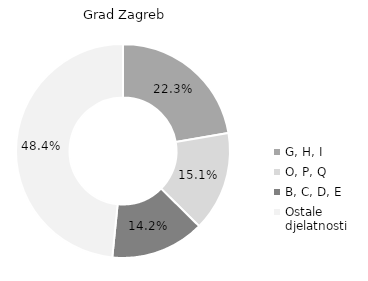
| Category | Grad Zagreb |
|---|---|
| G, H, I | 22.3 |
| O, P, Q | 15.1 |
| B, C, D, E | 14.2 |
| Ostale djelatnosti | 48.4 |